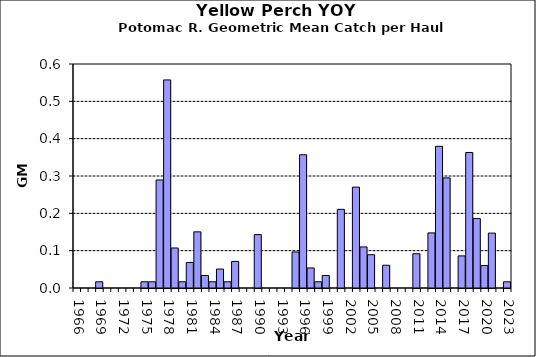
| Category | Series 0 |
|---|---|
| 1966.0 | 0 |
| 1967.0 | 0 |
| 1968.0 | 0 |
| 1969.0 | 0.017 |
| 1970.0 | 0 |
| 1971.0 | 0 |
| 1972.0 | 0 |
| 1973.0 | 0 |
| 1974.0 | 0 |
| 1975.0 | 0.017 |
| 1976.0 | 0.017 |
| 1977.0 | 0.289 |
| 1978.0 | 0.557 |
| 1979.0 | 0.107 |
| 1980.0 | 0.017 |
| 1981.0 | 0.068 |
| 1982.0 | 0.15 |
| 1983.0 | 0.034 |
| 1984.0 | 0.017 |
| 1985.0 | 0.051 |
| 1986.0 | 0.017 |
| 1987.0 | 0.071 |
| 1988.0 | 0 |
| 1989.0 | 0 |
| 1990.0 | 0.143 |
| 1991.0 | 0 |
| 1992.0 | 0 |
| 1993.0 | 0 |
| 1994.0 | 0 |
| 1995.0 | 0.097 |
| 1996.0 | 0.357 |
| 1997.0 | 0.054 |
| 1998.0 | 0.017 |
| 1999.0 | 0.034 |
| 2000.0 | 0 |
| 2001.0 | 0.211 |
| 2002.0 | 0 |
| 2003.0 | 0.27 |
| 2004.0 | 0.11 |
| 2005.0 | 0.089 |
| 2006.0 | 0 |
| 2007.0 | 0.061 |
| 2008.0 | 0 |
| 2009.0 | 0 |
| 2010.0 | 0 |
| 2011.0 | 0.092 |
| 2012.0 | 0 |
| 2013.0 | 0.148 |
| 2014.0 | 0.379 |
| 2015.0 | 0.295 |
| 2016.0 | 0 |
| 2017.0 | 0.086 |
| 2018.0 | 0.363 |
| 2019.0 | 0.186 |
| 2020.0 | 0.06 |
| 2021.0 | 0.147 |
| 2022.0 | 0 |
| 2023.0 | 0.017 |